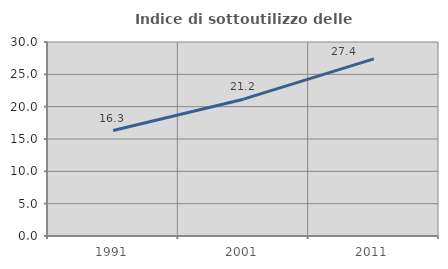
| Category | Indice di sottoutilizzo delle abitazioni  |
|---|---|
| 1991.0 | 16.314 |
| 2001.0 | 21.158 |
| 2011.0 | 27.383 |